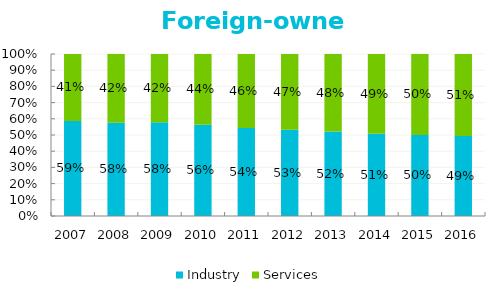
| Category | Industry | Services |
|---|---|---|
| 2007.0 | 0.587 | 0.413 |
| 2008.0 | 0.576 | 0.424 |
| 2009.0 | 0.578 | 0.422 |
| 2010.0 | 0.563 | 0.437 |
| 2011.0 | 0.543 | 0.457 |
| 2012.0 | 0.532 | 0.468 |
| 2013.0 | 0.522 | 0.478 |
| 2014.0 | 0.508 | 0.492 |
| 2015.0 | 0.5 | 0.5 |
| 2016.0 | 0.494 | 0.506 |